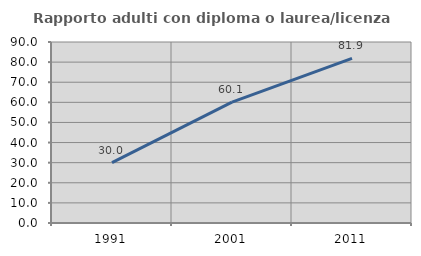
| Category | Rapporto adulti con diploma o laurea/licenza media  |
|---|---|
| 1991.0 | 29.978 |
| 2001.0 | 60.114 |
| 2011.0 | 81.9 |